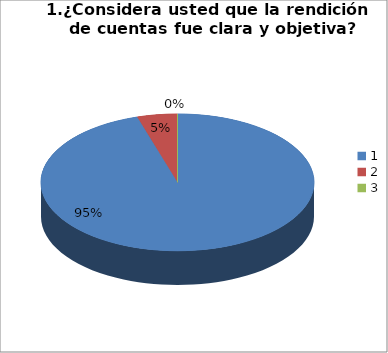
| Category | Series 0 |
|---|---|
| 0 | 60 |
| 1 | 3 |
| 2 | 0 |